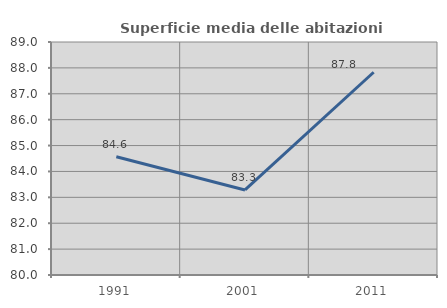
| Category | Superficie media delle abitazioni occupate |
|---|---|
| 1991.0 | 84.567 |
| 2001.0 | 83.284 |
| 2011.0 | 87.831 |